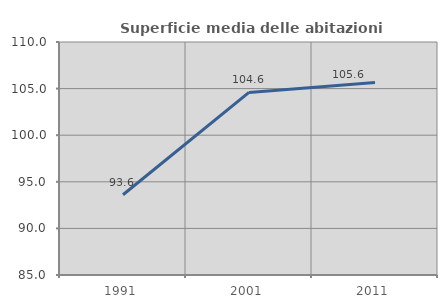
| Category | Superficie media delle abitazioni occupate |
|---|---|
| 1991.0 | 93.607 |
| 2001.0 | 104.592 |
| 2011.0 | 105.645 |